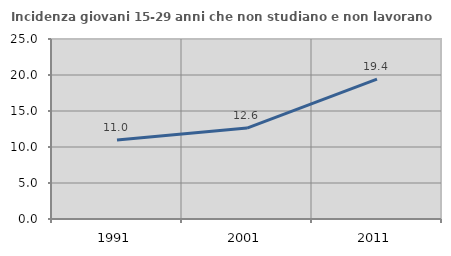
| Category | Incidenza giovani 15-29 anni che non studiano e non lavorano  |
|---|---|
| 1991.0 | 10.964 |
| 2001.0 | 12.628 |
| 2011.0 | 19.421 |